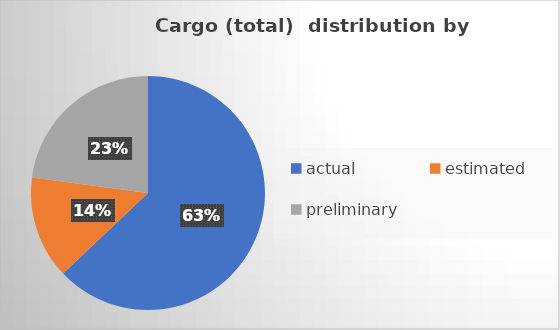
| Category | Series 0 |
|---|---|
| actual | 332509 |
| estimated | 74982 |
| preliminary | 120945 |